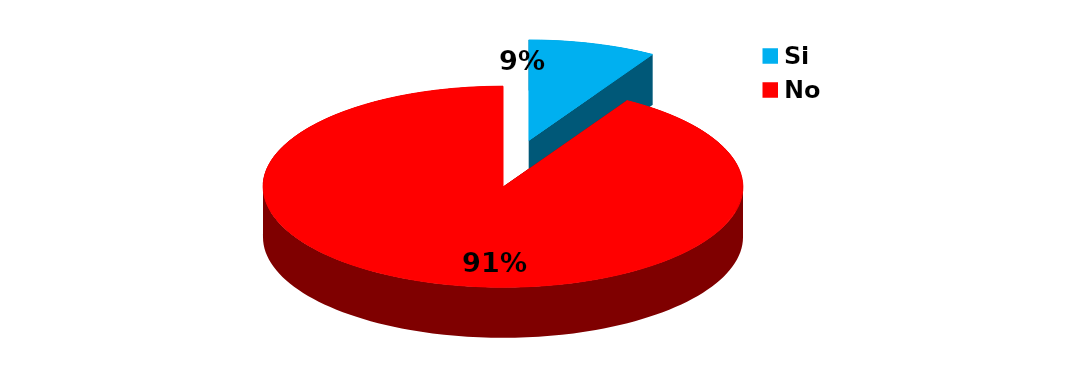
| Category | Series 0 |
|---|---|
| Si | 5 |
| No | 53 |